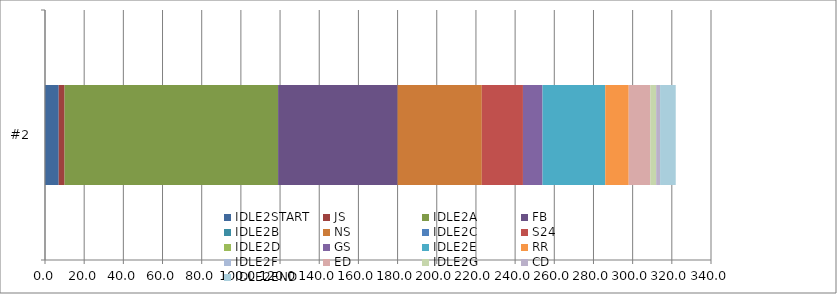
| Category | IDLE2START | JS | IDLE2A | FB | IDLE2B | NS | IDLE2C | S24 | IDLE2D | GS | IDLE2E | RR | IDLE2F | ED | IDLE2G | CD | IDLE2END |
|---|---|---|---|---|---|---|---|---|---|---|---|---|---|---|---|---|---|
| #2 | 7 | 3 | 109 | 61 | 0 | 43 | 0 | 21 | 0 | 10 | 32 | 12 | 0 | 11 | 3 | 2 | 8 |